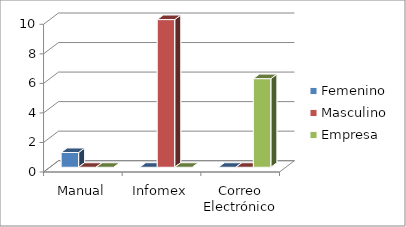
| Category | Femenino | Masculino | Empresa |
|---|---|---|---|
| 0 | 1 | 0 | 0 |
| 1 | 0 | 10 | 0 |
| 2 | 0 | 0 | 6 |